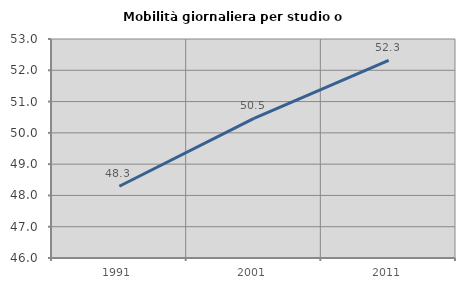
| Category | Mobilità giornaliera per studio o lavoro |
|---|---|
| 1991.0 | 48.292 |
| 2001.0 | 50.46 |
| 2011.0 | 52.319 |